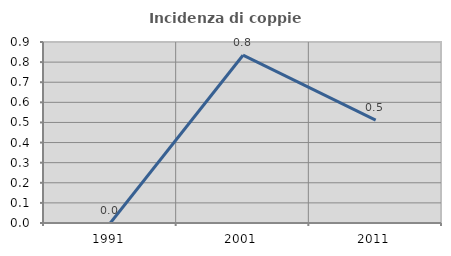
| Category | Incidenza di coppie miste |
|---|---|
| 1991.0 | 0 |
| 2001.0 | 0.834 |
| 2011.0 | 0.512 |